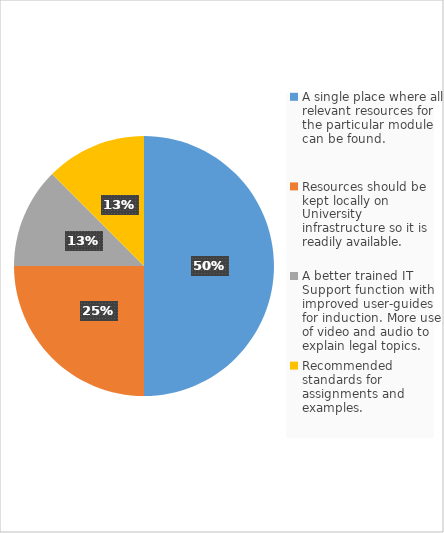
| Category | Series 0 |
|---|---|
| A single place where all relevant resources for the particular module can be found.  | 4 |
| Resources should be kept locally on University infrastructure so it is readily available. | 2 |
| A better trained IT Support function with improved user-guides for induction. More use of video and audio to explain legal topics. | 1 |
| Recommended standards for assignments and examples. | 1 |